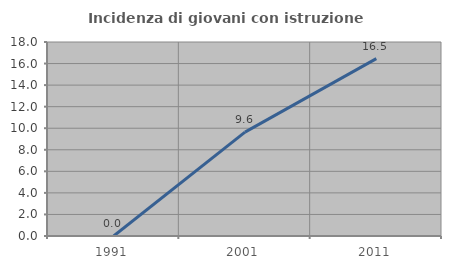
| Category | Incidenza di giovani con istruzione universitaria |
|---|---|
| 1991.0 | 0 |
| 2001.0 | 9.639 |
| 2011.0 | 16.456 |